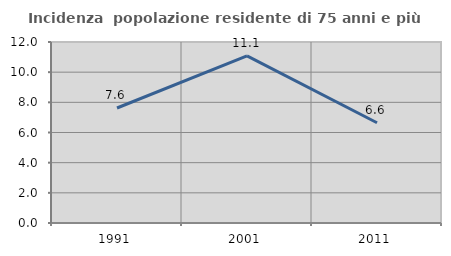
| Category | Incidenza  popolazione residente di 75 anni e più |
|---|---|
| 1991.0 | 7.625 |
| 2001.0 | 11.08 |
| 2011.0 | 6.649 |